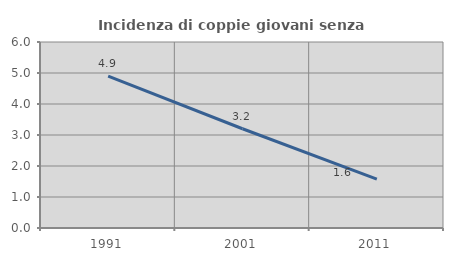
| Category | Incidenza di coppie giovani senza figli |
|---|---|
| 1991.0 | 4.897 |
| 2001.0 | 3.201 |
| 2011.0 | 1.579 |